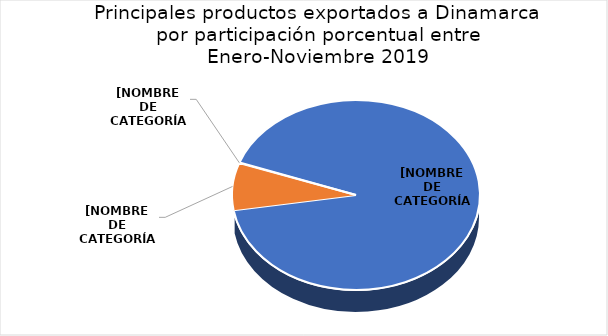
| Category | Series 0 |
|---|---|
| Grasas y aceites de pescado y sus fracciones, excepto los aceites de hígado | 0.918 |
| Camarones cultivados sin ahumar | 0.08 |
| Café tostado descafeinado | 0.001 |